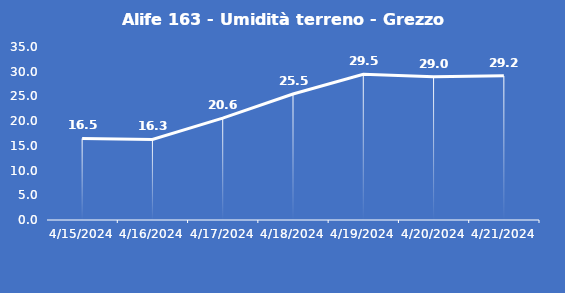
| Category | Alife 163 - Umidità terreno - Grezzo (%VWC) |
|---|---|
| 4/15/24 | 16.5 |
| 4/16/24 | 16.3 |
| 4/17/24 | 20.6 |
| 4/18/24 | 25.5 |
| 4/19/24 | 29.5 |
| 4/20/24 | 29 |
| 4/21/24 | 29.2 |